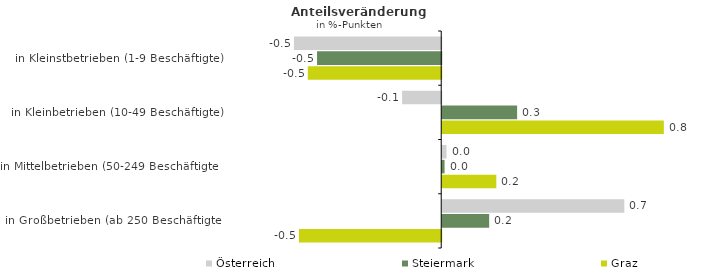
| Category | Österreich | Steiermark | Graz |
|---|---|---|---|
| in Kleinstbetrieben (1-9 Beschäftigte) | -0.55 | -0.464 | -0.498 |
| in Kleinbetrieben (10-49 Beschäftigte) | -0.146 | 0.28 | 0.828 |
| in Mittelbetrieben (50-249 Beschäftigte) | 0.016 | 0.009 | 0.202 |
| in Großbetrieben (ab 250 Beschäftigte) | 0.68 | 0.175 | -0.531 |